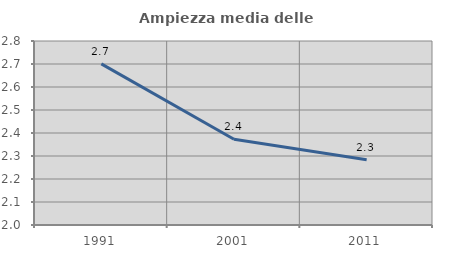
| Category | Ampiezza media delle famiglie |
|---|---|
| 1991.0 | 2.7 |
| 2001.0 | 2.373 |
| 2011.0 | 2.284 |